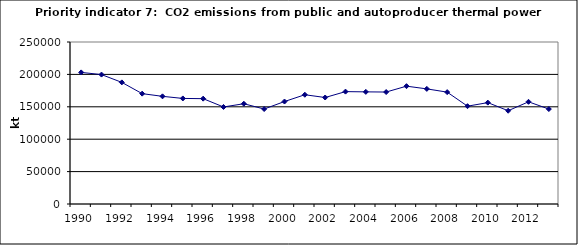
| Category | CO2 emissions from public and autoproducer thermal power stations, kt |
|---|---|
| 1990 | 203096.274 |
| 1991 | 199711.115 |
| 1992 | 187675.945 |
| 1993 | 170303.531 |
| 1994 | 166147.273 |
| 1995 | 162910.562 |
| 1996 | 162561.482 |
| 1997 | 149729.396 |
| 1998 | 154727.475 |
| 1999 | 146577.06 |
| 2000 | 158154.425 |
| 2001 | 168602.77 |
| 2002 | 164339.586 |
| 2003 | 173423.533 |
| 2004 | 173034.52 |
| 2005 | 172767.539 |
| 2006 | 181835.019 |
| 2007 | 177640.53 |
| 2008 | 172626.516 |
| 2009 | 150948.042 |
| 2010 | 156447.75 |
| 2011 | 143929.225 |
| 2012 | 157720.367 |
| 2013 | 146519.626 |